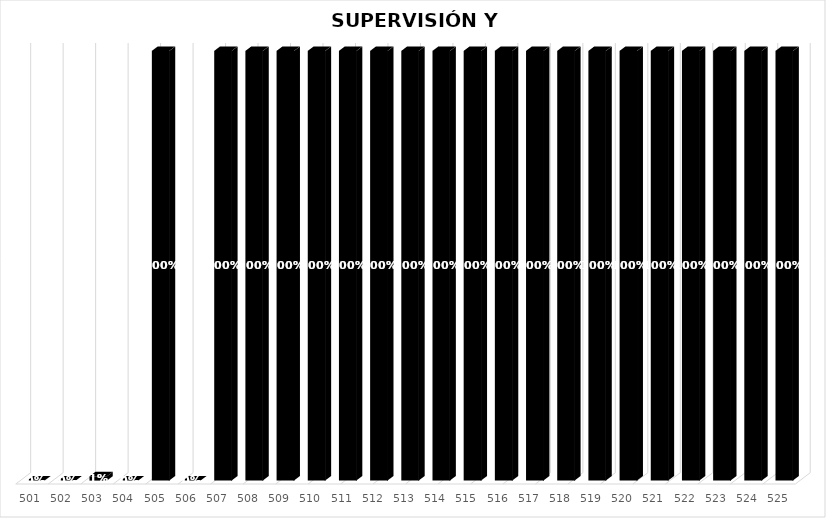
| Category | % Avance |
|---|---|
| 501.0 | 0 |
| 502.0 | 0 |
| 503.0 | 0.01 |
| 504.0 | 0 |
| 505.0 | 1 |
| 506.0 | 0 |
| 507.0 | 1 |
| 508.0 | 1 |
| 509.0 | 1 |
| 510.0 | 1 |
| 511.0 | 1 |
| 512.0 | 1 |
| 513.0 | 1 |
| 514.0 | 1 |
| 515.0 | 1 |
| 516.0 | 1 |
| 517.0 | 1 |
| 518.0 | 1 |
| 519.0 | 1 |
| 520.0 | 1 |
| 521.0 | 1 |
| 522.0 | 1 |
| 523.0 | 1 |
| 524.0 | 1 |
| 525.0 | 1 |